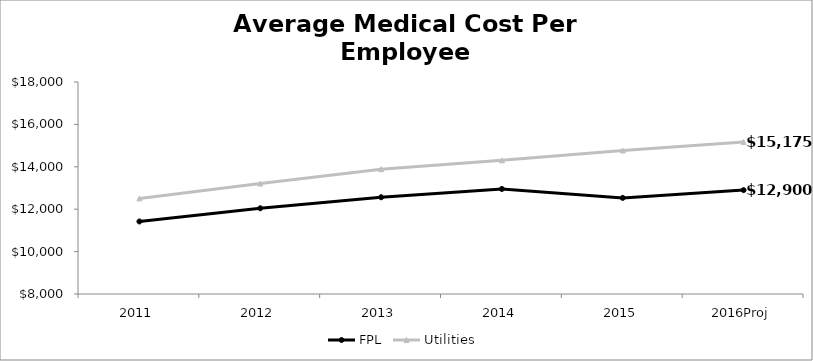
| Category | FPL | Utilities  |
|---|---|---|
| 2011 | 11420.4 | 12507 |
| 2012 | 12044.22 | 13209.117 |
| 2013 | 12564.337 | 13887.063 |
| 2014 | 12954.578 | 14303.675 |
| 2015 | 12533.255 | 14769.235 |
| 2016Proj | 12900.014 | 15174.507 |